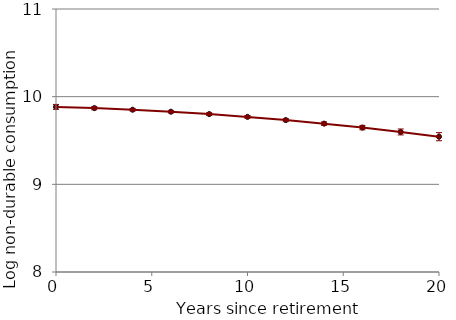
| Category | Series 0 |
|---|---|
| 0.0 | 9.883 |
| 2.0 | 9.869 |
| 4.0 | 9.851 |
| 6.0 | 9.828 |
| 8.0 | 9.801 |
| 10.0 | 9.769 |
| 12.0 | 9.733 |
| 14.0 | 9.692 |
| 16.0 | 9.647 |
| 18.0 | 9.597 |
| 20.0 | 9.543 |